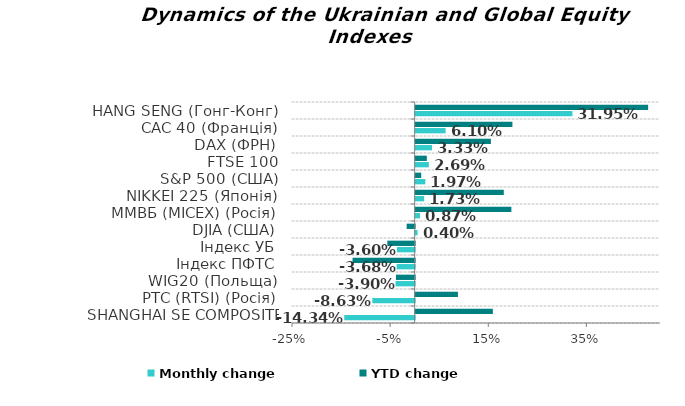
| Category | Monthly change | YTD change |
|---|---|---|
| SHANGHAI SE COMPOSITE (Китай) | -0.143 | 0.157 |
| РТС (RTSI) (Росія) | -0.086 | 0.086 |
| WIG20 (Польща) | -0.039 | -0.038 |
| Індекс ПФТС | -0.037 | -0.127 |
| Індекс УБ | -0.036 | -0.056 |
| DJIA (США) | 0.004 | -0.016 |
| ММВБ (MICEX) (Росія) | 0.009 | 0.195 |
| NIKKEI 225 (Японія) | 0.017 | 0.18 |
| S&P 500 (США) | 0.02 | 0.011 |
| FTSE 100  (Великобританія) | 0.027 | 0.023 |
| DAX (ФРН) | 0.033 | 0.153 |
| CAC 40 (Франція) | 0.061 | 0.197 |
| HANG SENG (Гонг-Конг) | 0.319 | 0.474 |